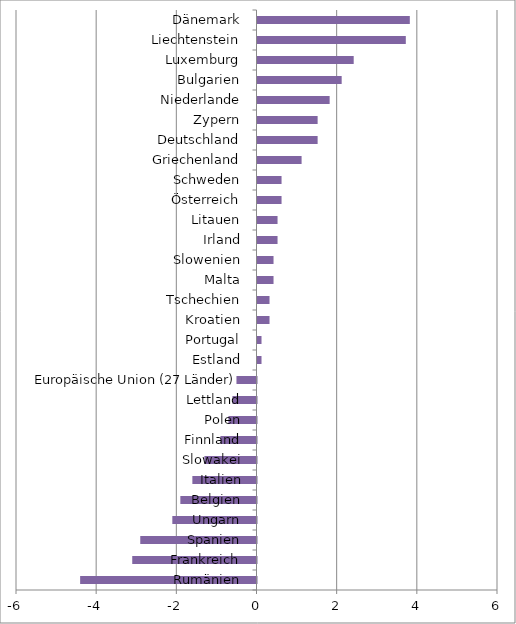
| Category | Series 0 |
|---|---|
| Rumänien | -4.4 |
| Frankreich | -3.1 |
| Spanien | -2.9 |
| Ungarn | -2.1 |
| Belgien | -1.9 |
| Italien | -1.6 |
| Slowakei | -1.3 |
| Finnland | -0.9 |
| Polen | -0.7 |
| Lettland | -0.6 |
| Europäische Union (27 Länder) | -0.5 |
| Estland | 0.1 |
| Portugal | 0.1 |
| Kroatien | 0.3 |
| Tschechien | 0.3 |
| Malta | 0.4 |
| Slowenien | 0.4 |
| Irland | 0.5 |
| Litauen | 0.5 |
| Österreich | 0.6 |
| Schweden | 0.6 |
| Griechenland | 1.1 |
| Deutschland | 1.5 |
| Zypern | 1.5 |
| Niederlande | 1.8 |
| Bulgarien | 2.1 |
| Luxemburg | 2.4 |
| Liechtenstein | 3.7 |
| Dänemark | 3.8 |